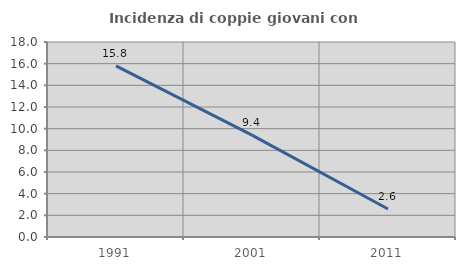
| Category | Incidenza di coppie giovani con figli |
|---|---|
| 1991.0 | 15.789 |
| 2001.0 | 9.406 |
| 2011.0 | 2.584 |